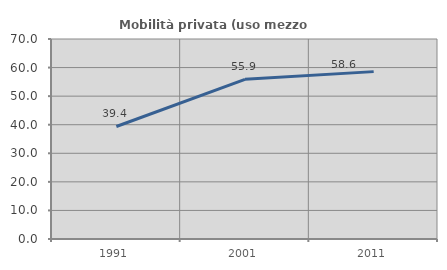
| Category | Mobilità privata (uso mezzo privato) |
|---|---|
| 1991.0 | 39.385 |
| 2001.0 | 55.881 |
| 2011.0 | 58.581 |